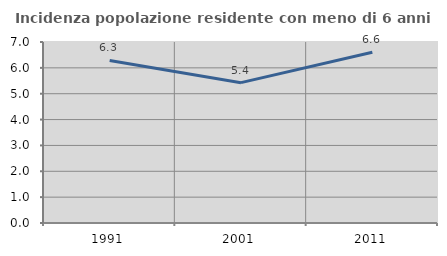
| Category | Incidenza popolazione residente con meno di 6 anni |
|---|---|
| 1991.0 | 6.286 |
| 2001.0 | 5.428 |
| 2011.0 | 6.601 |